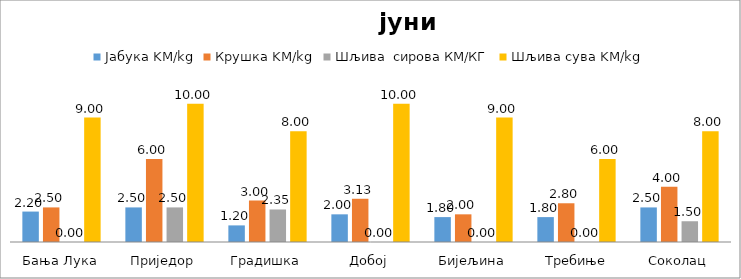
| Category | Јабука | Крушка | Шљива  сирова | Шљива сува |
|---|---|---|---|---|
| Бања Лука | 2.2 | 2.5 | 0 | 9 |
| Приједор | 2.5 | 5.995 | 2.5 | 10 |
| Градишка | 1.2 | 3 | 2.35 | 8 |
| Добој | 2 | 3.125 | 0 | 10 |
| Бијељина | 1.8 | 2 | 0 | 9 |
|  Требиње | 1.8 | 2.8 | 0 | 6 |
| Соколац | 2.5 | 4 | 1.5 | 8 |